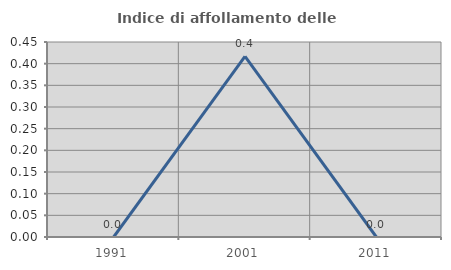
| Category | Indice di affollamento delle abitazioni  |
|---|---|
| 1991.0 | 0 |
| 2001.0 | 0.417 |
| 2011.0 | 0 |